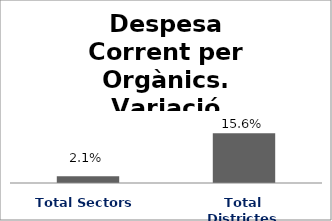
| Category | Series 0 |
|---|---|
| Total Sectors | 0.021 |
| Total Districtes | 0.156 |